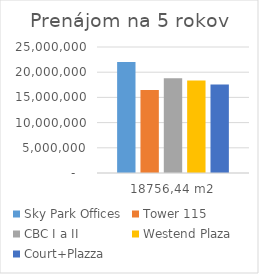
| Category | Sky Park Offices | Tower 115 | CBC I a II | Westend Plaza | Court+Plazza |
|---|---|---|---|---|---|
| 18756,44 m2 | 22017034.8 | 16460349.168 | 18793952.88 | 18328490.592 | 17538890.592 |